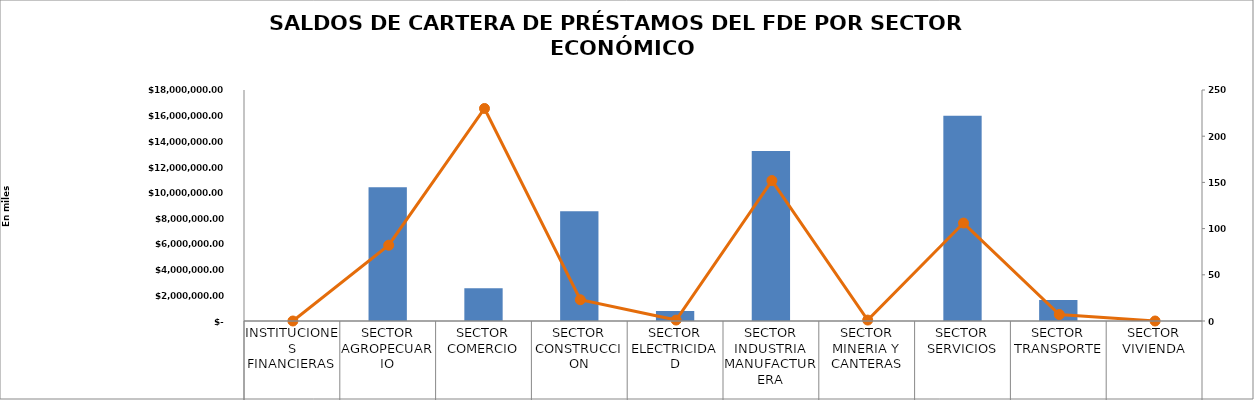
| Category |  Saldo del Crédito en Miles US$ |
|---|---|
| INSTITUCIONES FINANCIERAS | 0 |
| SECTOR AGROPECUARIO | 10422202.77 |
| SECTOR COMERCIO | 2553286.71 |
| SECTOR CONSTRUCCION | 8554669.81 |
| SECTOR ELECTRICIDAD | 770028.48 |
| SECTOR INDUSTRIA MANUFACTURERA | 13247804.64 |
| SECTOR MINERIA Y CANTERAS | 18963.3 |
| SECTOR SERVICIOS | 15983976.28 |
| SECTOR TRANSPORTE | 1644163 |
| SECTOR VIVIENDA | 0 |